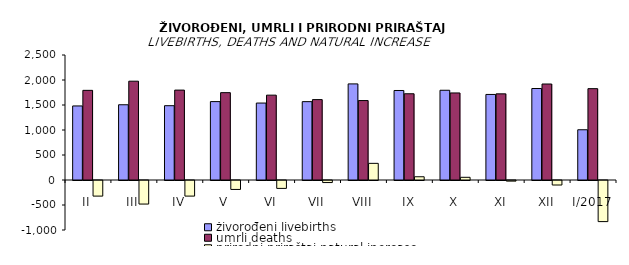
| Category | živorođeni livebirths | umrli deaths | prirodni priraštaj natural increase |
|---|---|---|---|
| II | 1481 | 1793 | -312 |
| III | 1505 | 1976 | -471 |
| IV | 1486 | 1798 | -312 |
| V | 1568 | 1747 | -179 |
| VI | 1539 | 1697 | -158 |
| VII | 1567 | 1608 | -41 |
| VIII | 1922 | 1589 | 333 |
| IX | 1790 | 1725 | 65 |
| X | 1795 | 1741 | 54 |
| XI | 1711 | 1723 | -12 |
| XII | 1830 | 1920 | -90 |
| I/2017 | 1005 | 1827 | -822 |